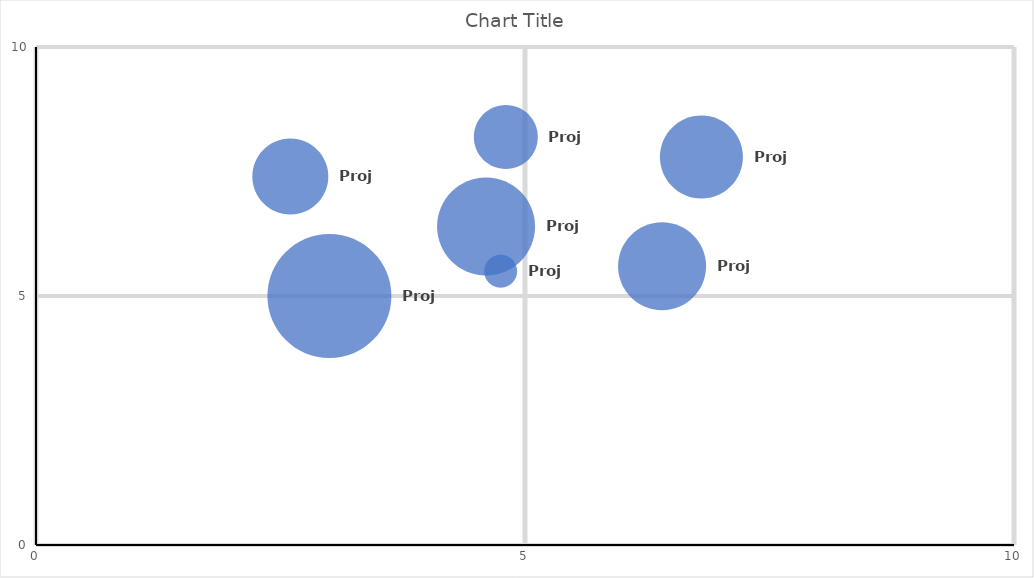
| Category | Series 0 |
|---|---|
| 4.75 | 5.5 |
| 2.6 | 7.4 |
| 4.6 | 6.4 |
| 6.8 | 7.8 |
| 3.0 | 5 |
| 6.4 | 5.6 |
| 4.8 | 8.2 |